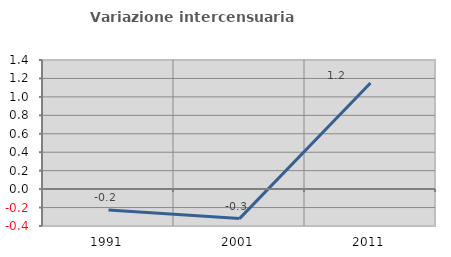
| Category | Variazione intercensuaria annua |
|---|---|
| 1991.0 | -0.226 |
| 2001.0 | -0.32 |
| 2011.0 | 1.151 |